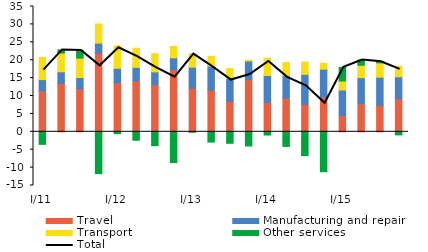
| Category | Travel | Manufacturing and repair | Transport  | Other services |
|---|---|---|---|---|
| I/11 | 11.431 | 3.156 | 6.162 | -3.509 |
| II | 13.528 | 3.236 | 5.236 | 0.875 |
| III | 12.037 | 3.104 | 5.449 | 2.149 |
| IV | 21.941 | 2.823 | 5.35 | -11.684 |
| I/12 | 13.692 | 4.048 | 6.252 | -0.513 |
| II | 14.269 | 3.724 | 5.341 | -2.361 |
| III | 13.14 | 3.585 | 5.083 | -3.885 |
| IV | 17.276 | 3.385 | 3.188 | -8.597 |
| I/13 | 12.195 | 5.852 | 3.788 | -0.133 |
| II | 11.675 | 6.652 | 2.738 | -2.878 |
| III | 8.529 | 6.323 | 2.82 | -3.214 |
| IV | 14.674 | 5.118 | 0.175 | -3.954 |
| I/14 | 8.232 | 7.501 | 4.806 | -0.903 |
| II | 9.456 | 6.22 | 3.647 | -4.097 |
| III | 7.658 | 8.387 | 3.426 | -6.647 |
| IV | 9.714 | 7.786 | 1.615 | -11.151 |
| I/15 | 4.536 | 7.134 | 2.527 | 3.81 |
| II | 7.866 | 7.26 | 3.463 | 1.434 |
| III | 7.408 | 7.851 | 4.002 | 0.319 |
| IV | 9.267 | 6.106 | 2.919 | -0.86 |